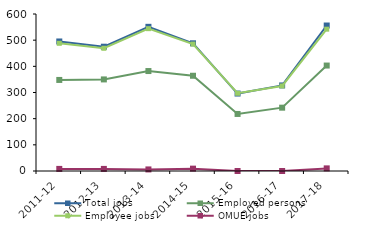
| Category | Total jobs | Employed persons | Employee jobs | OMUE jobs |
|---|---|---|---|---|
| 2011-12 | 495 | 348 | 488 | 8 |
| 2012-13 | 475 | 350 | 469 | 8 |
| 2013-14 | 551 | 382 | 544 | 6 |
| 2014-15 | 488 | 364 | 485 | 9 |
| 2015-16 | 296 | 218 | 297 | 0 |
| 2016-17 | 327 | 242 | 325 | 0 |
| 2017-18 | 556 | 403 | 542 | 10 |